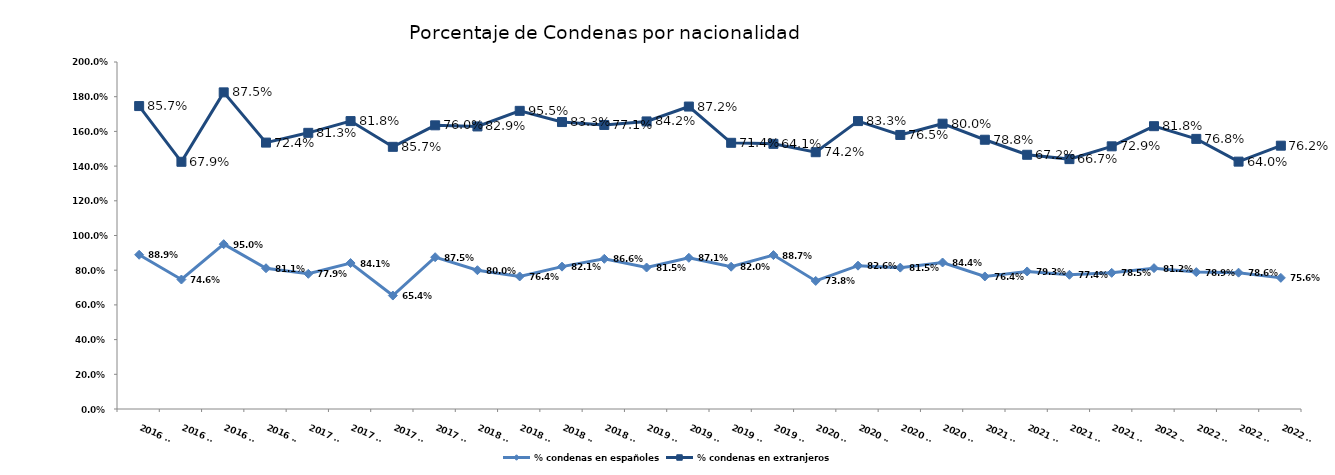
| Category | % condenas en españoles | % condenas en extranjeros |
|---|---|---|
| 2016 T1 | 0.889 | 0.857 |
| 2016 T2 | 0.746 | 0.679 |
| 2016 T3 | 0.95 | 0.875 |
| 2016 T4 | 0.811 | 0.724 |
| 2017 T1 | 0.779 | 0.812 |
| 2017 T2 | 0.841 | 0.818 |
| 2017 T3 | 0.654 | 0.857 |
| 2017 T4 | 0.875 | 0.76 |
| 2018 T1 | 0.8 | 0.829 |
| 2018 T2 | 0.764 | 0.955 |
| 2018 T3 | 0.821 | 0.833 |
| 2018 T4 | 0.866 | 0.771 |
| 2019 T1 | 0.815 | 0.842 |
| 2019 T2 | 0.871 | 0.872 |
| 2019 T3 | 0.82 | 0.714 |
| 2019 T4 | 0.887 | 0.641 |
| 2020 T1 | 0.738 | 0.742 |
| 2020 T2 | 0.826 | 0.833 |
| 2020 T3 | 0.815 | 0.765 |
| 2020 T4 | 0.844 | 0.8 |
| 2021 T1 | 0.764 | 0.788 |
| 2021 T2 | 0.793 | 0.672 |
| 2021 T3 | 0.774 | 0.667 |
| 2021 T4 | 0.785 | 0.729 |
| 2022 T1 | 0.812 | 0.818 |
| 2022 T2 | 0.789 | 0.768 |
| 2022 T3 | 0.786 | 0.64 |
| 2022 T4 | 0.756 | 0.762 |